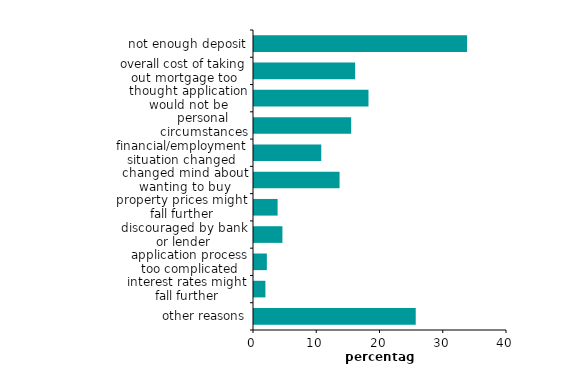
| Category | Series 1 |
|---|---|
| other reasons | 25.569 |
| interest rates might fall further | 1.807 |
| application process too complicated | 2.032 |
| discouraged by bank or lender | 4.494 |
| property prices might fall further | 3.732 |
| changed mind about wanting to buy | 13.525 |
| financial/employment situation changed | 10.635 |
| personal circumstances changed | 15.364 |
| thought application would not be approved | 18.101 |
| overall cost of taking out mortgage too high | 15.991 |
| not enough deposit | 33.69 |